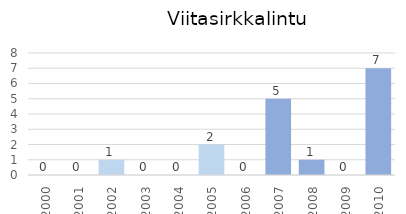
| Category | Series 0 |
|---|---|
| 2000.0 | 0 |
| 2001.0 | 0 |
| 2002.0 | 1 |
| 2003.0 | 0 |
| 2004.0 | 0 |
| 2005.0 | 2 |
| 2006.0 | 0 |
| 2007.0 | 5 |
| 2008.0 | 1 |
| 2009.0 | 0 |
| 2010.0 | 7 |